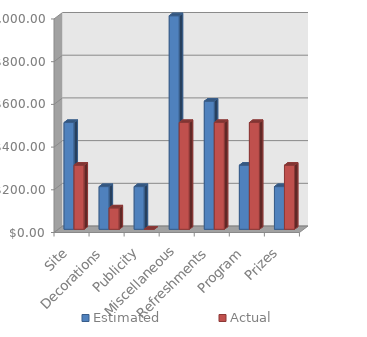
| Category | Estimated | Actual |
|---|---|---|
| Site | 500 | 300 |
| Decorations | 200 | 100 |
| Publicity | 200 | 0 |
| Miscellaneous | 1000 | 500 |
| Refreshments | 600 | 500 |
| Program | 300 | 500 |
| Prizes | 200 | 300 |